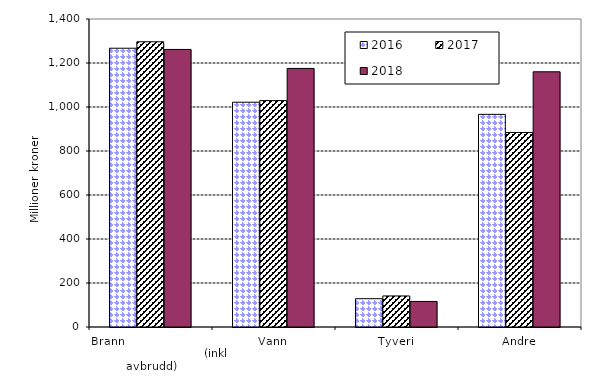
| Category | 2016 | 2017 | 2018 |
|---|---|---|---|
| Brann                                                       (inkl avbrudd) | 1267.177 | 1296.447 | 1261.6 |
| Vann | 1021.63 | 1029.148 | 1175.316 |
| Tyveri | 128.593 | 141.15 | 116.186 |
| Andre | 966.541 | 884.24 | 1160.015 |